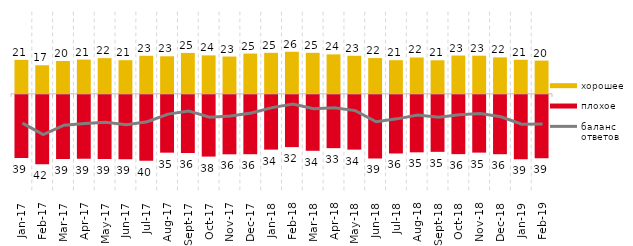
| Category | хорошее | плохое |
|---|---|---|
| 2017-01-01 | 20.75 | -38.65 |
| 2017-02-01 | 17.45 | -42.4 |
| 2017-03-01 | 20.05 | -39.25 |
| 2017-04-01 | 20.9 | -39 |
| 2017-05-01 | 21.8 | -39.15 |
| 2017-06-01 | 20.55 | -39.4 |
| 2017-07-01 | 23.25 | -40.3 |
| 2017-08-01 | 22.95 | -35.35 |
| 2017-09-01 | 25 | -35.55 |
| 2017-10-01 | 23.5 | -37.75 |
| 2017-11-01 | 22.8 | -36.35 |
| 2017-12-01 | 24.6 | -36.3 |
| 2018-01-01 | 25.05 | -33.5 |
| 2018-02-01 | 25.7 | -31.95 |
| 2018-03-01 | 25.05 | -34.2 |
| 2018-04-01 | 24.1 | -32.6 |
| 2018-05-01 | 23.25 | -33.5 |
| 2018-06-01 | 21.85 | -38.9 |
| 2018-07-01 | 20.55 | -35.85 |
| 2018-08-01 | 22.2 | -35.15 |
| 2018-09-01 | 20.5 | -34.85 |
| 2018-10-01 | 23.4 | -36.25 |
| 2018-11-01 | 23.303 | -35.329 |
| 2018-12-01 | 22.25 | -36.3 |
| 2019-01-01 | 20.8 | -39.35 |
| 2019-02-01 | 20.3 | -38.75 |